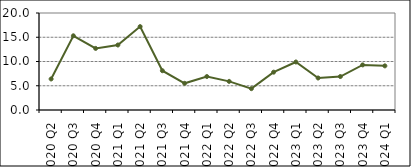
| Category | DualResult |
|---|---|
| 2020 Q2 | 6.4 |
| 2020 Q3 | 15.3 |
| 2020 Q4 | 12.7 |
| 2021 Q1 | 13.4 |
| 2021 Q2 | 17.2 |
| 2021 Q3 | 8.1 |
| 2021 Q4 | 5.5 |
| 2022 Q1 | 6.9 |
| 2022 Q2 | 5.9 |
| 2022 Q3 | 4.4 |
| 2022 Q4 | 7.8 |
| 2023 Q1 | 9.9 |
| 2023 Q2 | 6.6 |
| 2023 Q3 | 6.9 |
| 2023 Q4 | 9.3 |
| 2024 Q1 | 9.1 |